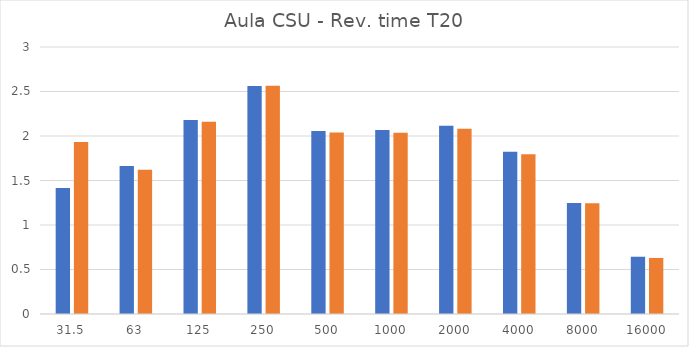
| Category | WY | Omni |
|---|---|---|
| 31.5 | 1.416 | 1.931 |
| 63.0 | 1.663 | 1.621 |
| 125.0 | 2.178 | 2.161 |
| 250.0 | 2.561 | 2.564 |
| 500.0 | 2.056 | 2.041 |
| 1000.0 | 2.068 | 2.036 |
| 2000.0 | 2.115 | 2.08 |
| 4000.0 | 1.822 | 1.794 |
| 8000.0 | 1.247 | 1.244 |
| 16000.0 | 0.643 | 0.63 |